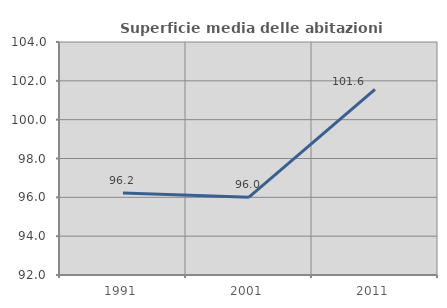
| Category | Superficie media delle abitazioni occupate |
|---|---|
| 1991.0 | 96.222 |
| 2001.0 | 96.009 |
| 2011.0 | 101.558 |